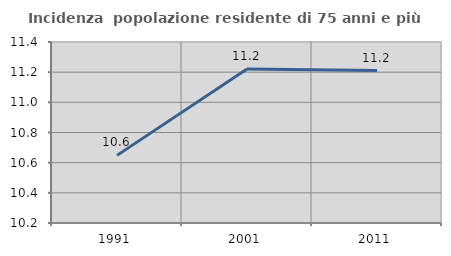
| Category | Incidenza  popolazione residente di 75 anni e più |
|---|---|
| 1991.0 | 10.648 |
| 2001.0 | 11.221 |
| 2011.0 | 11.211 |